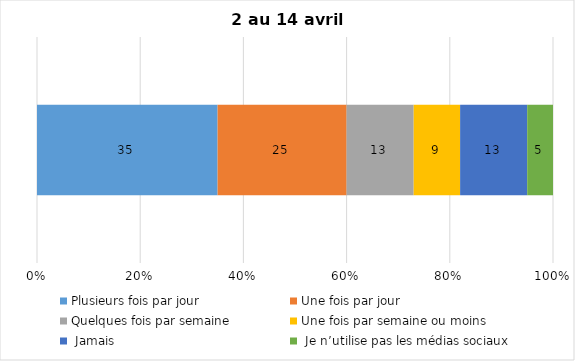
| Category | Plusieurs fois par jour | Une fois par jour | Quelques fois par semaine   | Une fois par semaine ou moins   |  Jamais   |  Je n’utilise pas les médias sociaux |
|---|---|---|---|---|---|---|
| 0 | 35 | 25 | 13 | 9 | 13 | 5 |